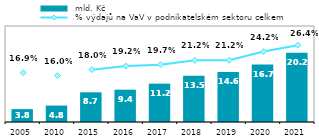
| Category |  mld. Kč |
|---|---|
| 2005 | 3.758 |
| 2010 | 4.79 |
| 2015 | 8.661 |
| 2016 | 9.421 |
| 2017 | 11.19 |
| 2018 | 13.495 |
| 2019 | 14.6 |
| 2020 | 16.739 |
| 2021 | 20.19 |